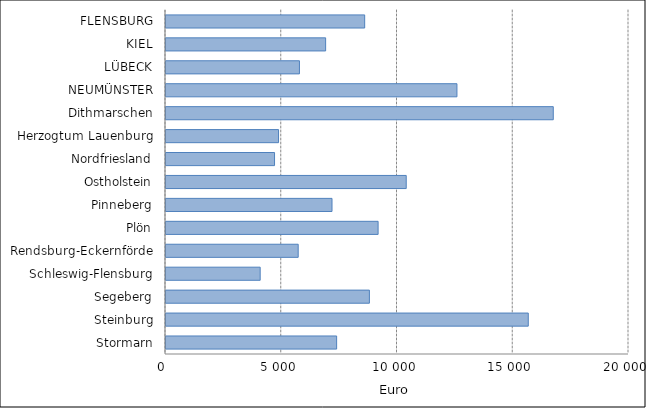
| Category | Euro |
|---|---|
| Stormarn | 7370.631 |
| Steinburg | 15648.688 |
| Segeberg | 8786.154 |
| Schleswig-Flensburg | 4068.224 |
| Rendsburg-Eckernförde | 5710.245 |
| Plön | 9162.384 |
| Pinneberg | 7171.09 |
| Ostholstein | 10376.957 |
| Nordfriesland | 4688.517 |
| Herzogtum Lauenburg | 4861.242 |
| Dithmarschen | 16728.743 |
| NEUMÜNSTER | 12567.709 |
| LÜBECK | 5764.228 |
| KIEL | 6895.507 |
| FLENSBURG | 8582.46 |